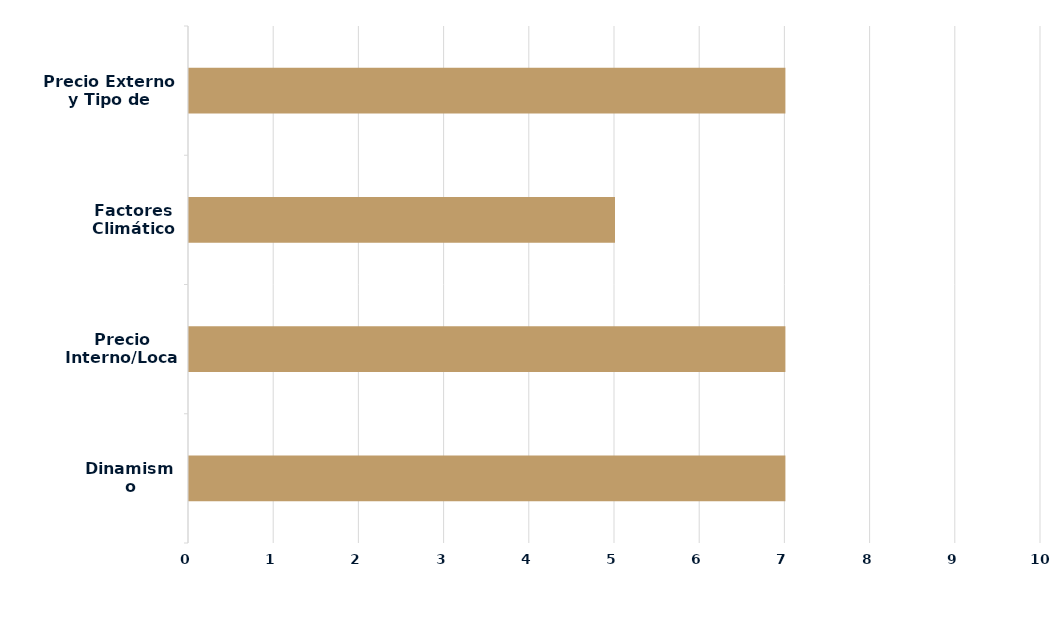
| Category | Series 0 |
|---|---|
| Dinamismo Demanda | 7 |
| Precio Interno/Local | 7 |
| Factores Climáticos | 5 |
| Precio Externo y Tipo de Cambio | 7 |